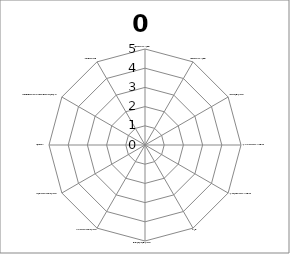
| Category | 0 |
|---|---|
| Intrapersoonlijke kwaliteiten | 0 |
| Interpersoonlijke kwaliteiten | 0 |
| Procesmatig handelen | 0 |
| Vakinhoudelijke deskundigheid | 0 |
| Vakdidactische deskundigheid | 0 |
| TPACK | 0 |
| Curriculair planmatig handelen | 0 |
| Inhoudelijk consistent handelen | 0 |
| Relationeel consistent handelen | 0 |
| Infrastructuur | 0 |
| Instellingsgebonden en juridisch geldende afspraken | 0 |
| Vormingsbehoefte | 0 |